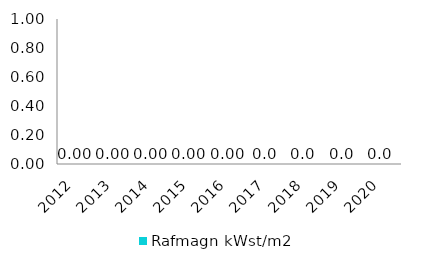
| Category | Rafmagn kWst/m2 |
|---|---|
| 2012.0 | 0 |
| 2013.0 | 0 |
| 2014.0 | 0 |
| 2015.0 | 0 |
| 2016.0 | 0 |
| 2017.0 | 0 |
| 2018.0 | 0 |
| 2019.0 | 0 |
| 2020.0 | 0 |